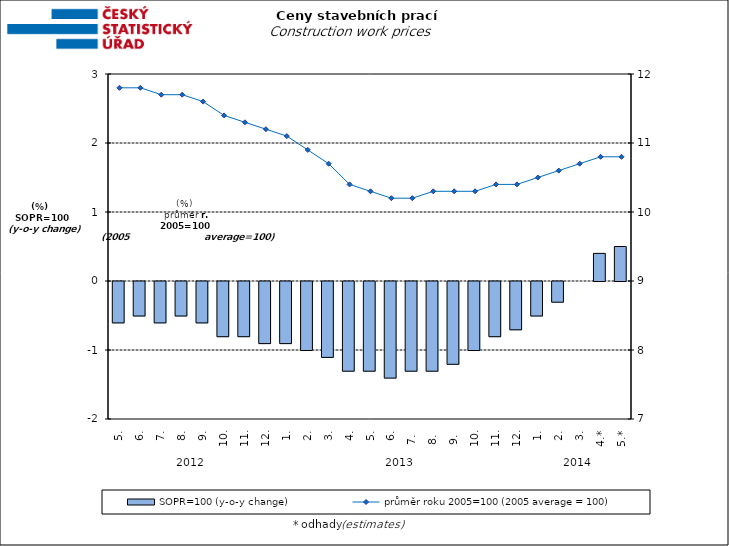
| Category | SOPR=100 (y-o-y change)   |
|---|---|
| 0 | -0.6 |
| 1 | -0.5 |
| 2 | -0.6 |
| 3 | -0.5 |
| 4 | -0.6 |
| 5 | -0.8 |
| 6 | -0.8 |
| 7 | -0.9 |
| 8 | -0.9 |
| 9 | -1 |
| 10 | -1.1 |
| 11 | -1.3 |
| 12 | -1.3 |
| 13 | -1.4 |
| 14 | -1.3 |
| 15 | -1.3 |
| 16 | -1.2 |
| 17 | -1 |
| 18 | -0.8 |
| 19 | -0.7 |
| 20 | -0.5 |
| 21 | -0.3 |
| 22 | 0 |
| 23 | 0.4 |
| 24 | 0.5 |